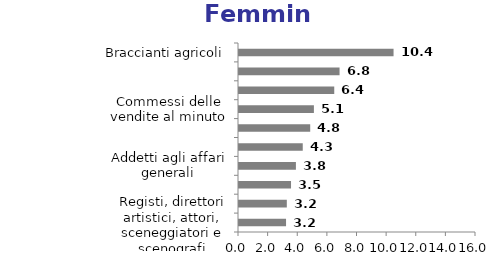
| Category | Series 0 |
|---|---|
| Braccianti agricoli | 10.434 |
| Addetti all'assistenza personale | 6.789 |
| Camerieri e professioni assimilate | 6.43 |
| Commessi delle vendite al minuto | 5.056 |
| Collaboratori domestici e professioni assimilate | 4.808 |
| Professori di scuola primaria | 4.304 |
| Addetti agli affari generali | 3.842 |
| Professori di scuola pre–primaria | 3.512 |
| Bidelli e professioni assimilate | 3.228 |
| Registi, direttori artistici, attori, sceneggiatori e scenografi | 3.176 |